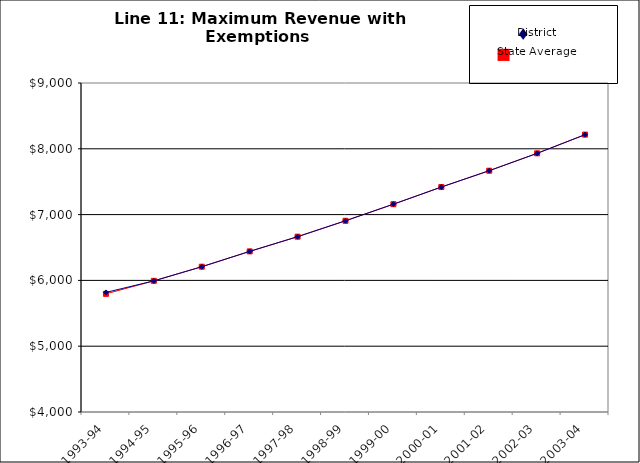
| Category | STATEWIDE |
|---|---|
| 1993-94 | 5795.598 |
| 1994-95 | 5993.401 |
| 1995-96 | 6208.292 |
| 1996-97 | 6440.854 |
| 1997-98 | 6664.549 |
| 1998-99 | 6906.076 |
| 1999-00 | 7158.19 |
| 2000-01 | 7418.612 |
| 2001-02 | 7667.185 |
| 2002-03 | 7931.027 |
| 2003-04 | 8215.791 |